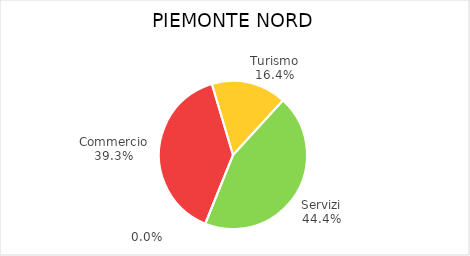
| Category | Piemonte Nord |
|---|---|
| Commercio | 21282 |
| Turismo | 8888 |
| Servizi | 24013 |